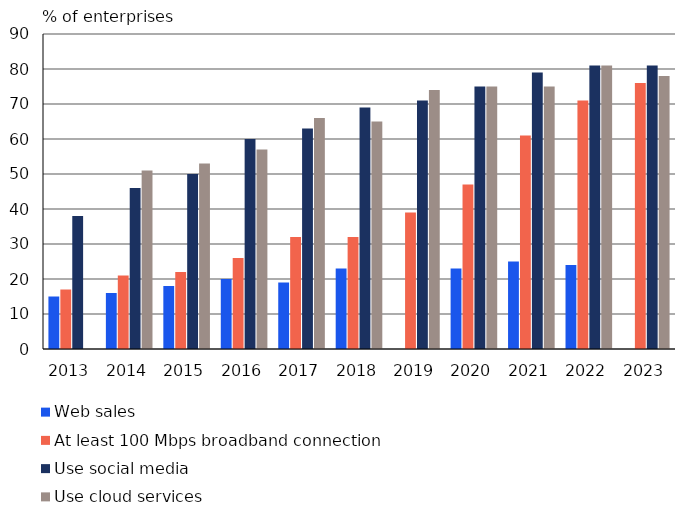
| Category | Web sales | At least 100 Mbps broadband connection | Use social media | Use cloud services |
|---|---|---|---|---|
| 2013.0 | 15 | 17 | 38 | 0 |
| 2014.0 | 16 | 21 | 46 | 51 |
| 2015.0 | 18 | 22 | 50 | 53 |
| 2016.0 | 20 | 26 | 60 | 57 |
| 2017.0 | 19 | 32 | 63 | 66 |
| 2018.0 | 23 | 32 | 69 | 65 |
| 2019.0 | 0 | 39 | 71 | 74 |
| 2020.0 | 23 | 47 | 75 | 75 |
| 2021.0 | 25 | 61 | 79 | 75 |
| 2022.0 | 24 | 71 | 81 | 81 |
| 2023.0 | 0 | 76 | 81 | 78 |